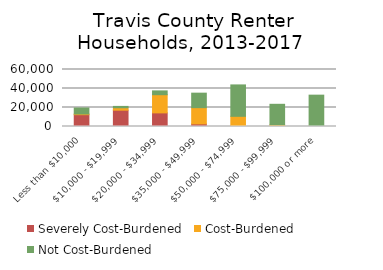
| Category | Severely Cost-Burdened | Cost-Burdened | Not Cost-Burdened |
|---|---|---|---|
|   Less than $10,000 | 12433 | 752 | 6286 |
|   $10,000 - $19,999 | 17174 | 2557 | 1417 |
|   $20,000 - $34,999 | 14343 | 19119 | 4017 |
|   $35,000 - $49,999 | 2735 | 17115 | 15249 |
|   $50,000 - $74,999 | 833 | 9886 | 33058 |
|   $75,000 - $99,999 | 134 | 1617 | 21614 |
|   $100,000 or more | 0 | 587 | 32410 |